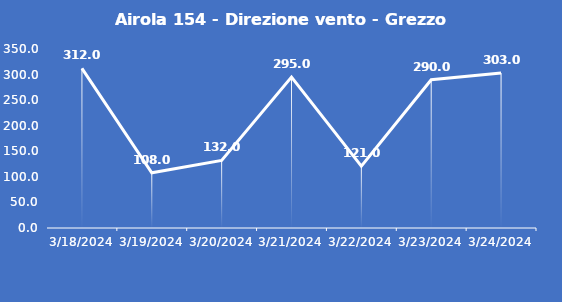
| Category | Airola 154 - Direzione vento - Grezzo (°N) |
|---|---|
| 3/18/24 | 312 |
| 3/19/24 | 108 |
| 3/20/24 | 132 |
| 3/21/24 | 295 |
| 3/22/24 | 121 |
| 3/23/24 | 290 |
| 3/24/24 | 303 |